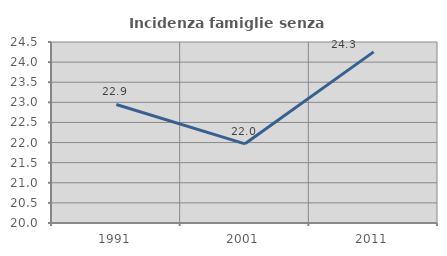
| Category | Incidenza famiglie senza nuclei |
|---|---|
| 1991.0 | 22.947 |
| 2001.0 | 21.968 |
| 2011.0 | 24.254 |